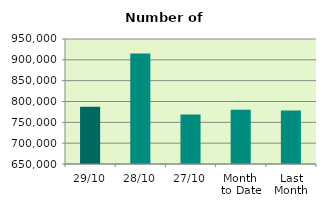
| Category | Series 0 |
|---|---|
| 29/10 | 787340 |
| 28/10 | 915240 |
| 27/10 | 768654 |
| Month 
to Date | 780428.952 |
| Last
Month | 778605.273 |